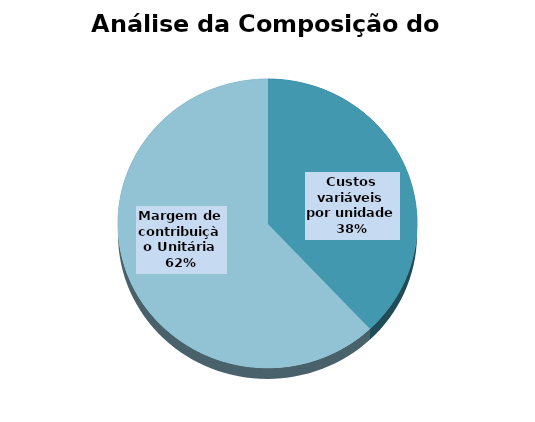
| Category | Series 0 |
|---|---|
| Custos variáveis por unidade | 7.6 |
| Margem de contribuiçào Unitária | 12.4 |